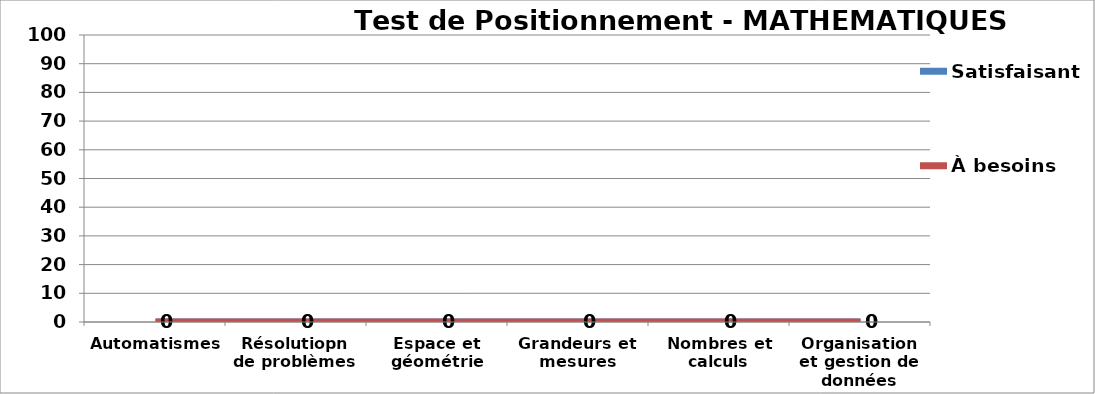
| Category | Satisfaisant | À besoins |
|---|---|---|
| Automatismes | 0 | 0 |
| Résolutiopn de problèmes | 0 | 0 |
| Espace et géométrie | 0 | 0 |
| Grandeurs et mesures | 0 | 0 |
| Nombres et calculs | 0 | 0 |
| Organisation et gestion de données | 0 | 0 |